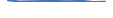
| Category | Series 0 |
|---|---|
| 0 | 17 |
| 1 | 6 |
| 2 | 7 |
| 3 | 10 |
| 4 | 10 |
| 5 | 7 |
| 6 | 12 |
| 7 | 1 |
| 8 | 3 |